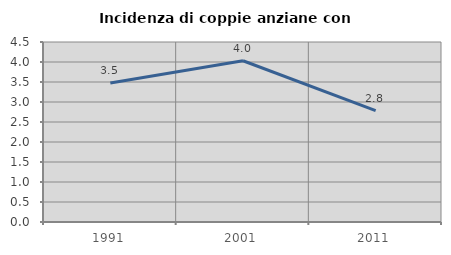
| Category | Incidenza di coppie anziane con figli |
|---|---|
| 1991.0 | 3.476 |
| 2001.0 | 4.031 |
| 2011.0 | 2.787 |